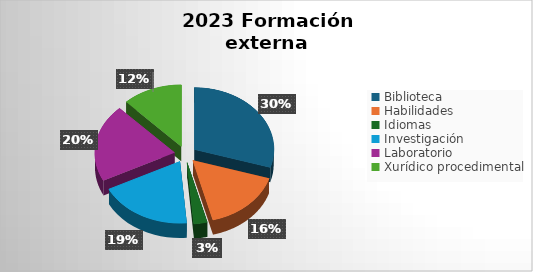
| Category | Series 0 |
|---|---|
| Biblioteca | 22 |
| Habilidades | 12 |
| Idiomas | 2 |
| Investigación | 14 |
| Laboratorio | 15 |
| Xurídico procedimental | 9 |